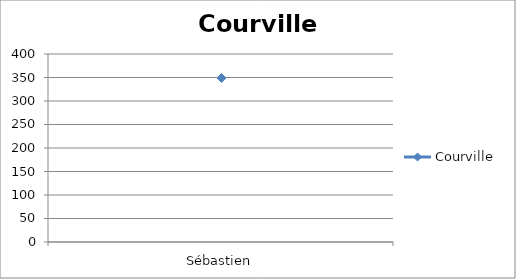
| Category | Courville |
|---|---|
| Sébastien | 349 |